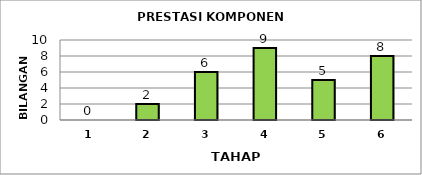
| Category | Series 0 |
|---|---|
| 1.0 | 0 |
| 2.0 | 2 |
| 3.0 | 6 |
| 4.0 | 9 |
| 5.0 | 5 |
| 6.0 | 8 |